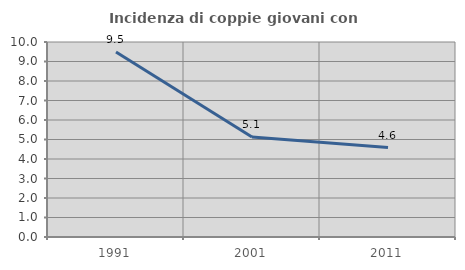
| Category | Incidenza di coppie giovani con figli |
|---|---|
| 1991.0 | 9.483 |
| 2001.0 | 5.128 |
| 2011.0 | 4.587 |